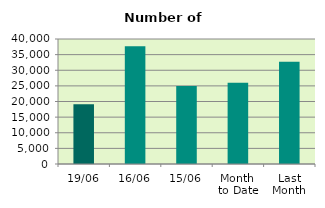
| Category | Series 0 |
|---|---|
| 19/06 | 19094 |
| 16/06 | 37652 |
| 15/06 | 24994 |
| Month 
to Date | 25984.769 |
| Last
Month | 32723.818 |